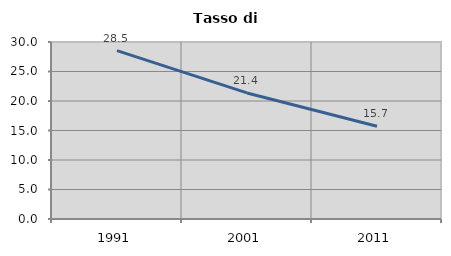
| Category | Tasso di disoccupazione   |
|---|---|
| 1991.0 | 28.533 |
| 2001.0 | 21.367 |
| 2011.0 | 15.716 |